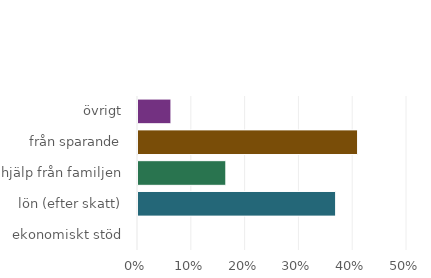
| Category | Series 0 |
|---|---|
| ekonomiskt stöd | 0 |
| lön (efter skatt) | 0.367 |
| hjälp från familjen | 0.163 |
| från sparande | 0.408 |
| övrigt | 0.061 |